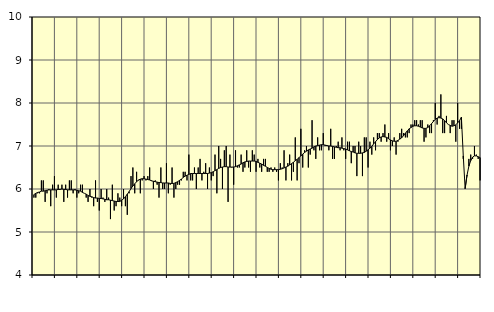
| Category | Personliga och kulturella tjänster, SNI 90-98 | Series 1 |
|---|---|---|
| nan | 5.8 | 5.87 |
| 1.0 | 5.8 | 5.9 |
| 1.0 | 5.9 | 5.92 |
| 1.0 | 5.9 | 5.93 |
| 1.0 | 6.2 | 5.95 |
| 1.0 | 6.2 | 5.95 |
| 1.0 | 5.7 | 5.96 |
| 1.0 | 5.9 | 5.97 |
| 1.0 | 6 | 5.98 |
| 1.0 | 5.6 | 5.98 |
| 1.0 | 6.1 | 5.98 |
| 1.0 | 6.3 | 5.98 |
| nan | 5.8 | 5.98 |
| 2.0 | 6.1 | 5.99 |
| 2.0 | 6 | 5.99 |
| 2.0 | 6.1 | 6 |
| 2.0 | 5.7 | 5.99 |
| 2.0 | 6.1 | 5.99 |
| 2.0 | 5.8 | 5.98 |
| 2.0 | 6.2 | 5.98 |
| 2.0 | 6.2 | 5.98 |
| 2.0 | 5.9 | 5.98 |
| 2.0 | 6 | 5.98 |
| 2.0 | 5.8 | 5.97 |
| nan | 5.9 | 5.96 |
| 3.0 | 6.1 | 5.95 |
| 3.0 | 6.1 | 5.92 |
| 3.0 | 5.9 | 5.9 |
| 3.0 | 5.8 | 5.88 |
| 3.0 | 5.7 | 5.85 |
| 3.0 | 6 | 5.83 |
| 3.0 | 5.8 | 5.82 |
| 3.0 | 5.6 | 5.8 |
| 3.0 | 6.2 | 5.79 |
| 3.0 | 5.7 | 5.79 |
| 3.0 | 5.5 | 5.78 |
| nan | 6 | 5.78 |
| 4.0 | 5.8 | 5.77 |
| 4.0 | 5.7 | 5.76 |
| 4.0 | 6 | 5.75 |
| 4.0 | 5.8 | 5.75 |
| 4.0 | 5.3 | 5.74 |
| 4.0 | 6.1 | 5.73 |
| 4.0 | 5.5 | 5.72 |
| 4.0 | 5.6 | 5.71 |
| 4.0 | 5.9 | 5.71 |
| 4.0 | 5.8 | 5.71 |
| 4.0 | 5.6 | 5.74 |
| nan | 6 | 5.77 |
| 5.0 | 5.6 | 5.82 |
| 5.0 | 5.4 | 5.88 |
| 5.0 | 5.9 | 5.94 |
| 5.0 | 6.3 | 6.01 |
| 5.0 | 6.5 | 6.07 |
| 5.0 | 5.9 | 6.12 |
| 5.0 | 6.4 | 6.17 |
| 5.0 | 6.2 | 6.21 |
| 5.0 | 5.9 | 6.23 |
| 5.0 | 6.2 | 6.24 |
| 5.0 | 6.3 | 6.24 |
| nan | 6.2 | 6.23 |
| 6.0 | 6.3 | 6.22 |
| 6.0 | 6.5 | 6.21 |
| 6.0 | 6.2 | 6.19 |
| 6.0 | 6 | 6.18 |
| 6.0 | 6.2 | 6.17 |
| 6.0 | 6.1 | 6.16 |
| 6.0 | 5.8 | 6.15 |
| 6.0 | 6.5 | 6.15 |
| 6.0 | 6 | 6.14 |
| 6.0 | 6 | 6.14 |
| 6.0 | 6.6 | 6.14 |
| nan | 5.9 | 6.14 |
| 7.0 | 6.1 | 6.13 |
| 7.0 | 6.5 | 6.13 |
| 7.0 | 5.8 | 6.13 |
| 7.0 | 6 | 6.15 |
| 7.0 | 6.1 | 6.17 |
| 7.0 | 6.1 | 6.2 |
| 7.0 | 6.2 | 6.23 |
| 7.0 | 6.4 | 6.27 |
| 7.0 | 6.4 | 6.3 |
| 7.0 | 6.2 | 6.32 |
| 7.0 | 6.8 | 6.34 |
| nan | 6.2 | 6.36 |
| 8.0 | 6.2 | 6.36 |
| 8.0 | 6.5 | 6.36 |
| 8.0 | 6 | 6.36 |
| 8.0 | 6.5 | 6.36 |
| 8.0 | 6.7 | 6.36 |
| 8.0 | 6.2 | 6.36 |
| 8.0 | 6.4 | 6.36 |
| 8.0 | 6.6 | 6.36 |
| 8.0 | 6 | 6.36 |
| 8.0 | 6.5 | 6.37 |
| 8.0 | 6.2 | 6.38 |
| nan | 6.3 | 6.4 |
| 9.0 | 6.8 | 6.43 |
| 9.0 | 5.9 | 6.45 |
| 9.0 | 7 | 6.48 |
| 9.0 | 6.7 | 6.5 |
| 9.0 | 6 | 6.51 |
| 9.0 | 6.9 | 6.52 |
| 9.0 | 7 | 6.52 |
| 9.0 | 5.7 | 6.51 |
| 9.0 | 6.8 | 6.51 |
| 9.0 | 6.5 | 6.51 |
| 9.0 | 6.1 | 6.51 |
| nan | 6.9 | 6.52 |
| 10.0 | 6.5 | 6.54 |
| 10.0 | 6.5 | 6.56 |
| 10.0 | 6.8 | 6.58 |
| 10.0 | 6.4 | 6.61 |
| 10.0 | 6.5 | 6.63 |
| 10.0 | 6.9 | 6.64 |
| 10.0 | 6.5 | 6.65 |
| 10.0 | 6.4 | 6.65 |
| 10.0 | 6.9 | 6.65 |
| 10.0 | 6.8 | 6.65 |
| 10.0 | 6.4 | 6.64 |
| nan | 6.7 | 6.62 |
| 11.0 | 6.5 | 6.6 |
| 11.0 | 6.4 | 6.58 |
| 11.0 | 6.7 | 6.55 |
| 11.0 | 6.7 | 6.53 |
| 11.0 | 6.4 | 6.5 |
| 11.0 | 6.4 | 6.48 |
| 11.0 | 6.5 | 6.46 |
| 11.0 | 6.4 | 6.45 |
| 11.0 | 6.5 | 6.45 |
| 11.0 | 6.4 | 6.45 |
| 11.0 | 6.2 | 6.45 |
| nan | 6.6 | 6.46 |
| 12.0 | 6.5 | 6.47 |
| 12.0 | 6.9 | 6.49 |
| 12.0 | 6.2 | 6.51 |
| 12.0 | 6.6 | 6.53 |
| 12.0 | 6.8 | 6.56 |
| 12.0 | 6.2 | 6.59 |
| 12.0 | 6.4 | 6.62 |
| 12.0 | 7.2 | 6.66 |
| 12.0 | 6.2 | 6.69 |
| 12.0 | 6.6 | 6.73 |
| 12.0 | 7.4 | 6.77 |
| nan | 6.5 | 6.81 |
| 13.0 | 6.9 | 6.85 |
| 13.0 | 7 | 6.88 |
| 13.0 | 6.5 | 6.91 |
| 13.0 | 6.8 | 6.93 |
| 13.0 | 7.6 | 6.95 |
| 13.0 | 6.9 | 6.98 |
| 13.0 | 6.7 | 7 |
| 13.0 | 7.2 | 7.01 |
| 13.0 | 6.9 | 7.02 |
| 13.0 | 6.9 | 7.03 |
| 13.0 | 7.3 | 7.03 |
| nan | 7 | 7.02 |
| 14.0 | 7 | 7.01 |
| 14.0 | 6.9 | 7 |
| 14.0 | 7.4 | 7 |
| 14.0 | 6.7 | 6.99 |
| 14.0 | 6.7 | 6.98 |
| 14.0 | 7 | 6.97 |
| 14.0 | 7.1 | 6.96 |
| 14.0 | 6.9 | 6.96 |
| 14.0 | 7.2 | 6.95 |
| 14.0 | 6.9 | 6.94 |
| 14.0 | 6.7 | 6.93 |
| nan | 7.1 | 6.91 |
| 15.0 | 7.1 | 6.89 |
| 15.0 | 6.6 | 6.87 |
| 15.0 | 7 | 6.86 |
| 15.0 | 7 | 6.84 |
| 15.0 | 6.3 | 6.83 |
| 15.0 | 7.1 | 6.83 |
| 15.0 | 7 | 6.83 |
| 15.0 | 6.3 | 6.84 |
| 15.0 | 7.2 | 6.85 |
| 15.0 | 7.2 | 6.88 |
| 15.0 | 6.5 | 6.91 |
| nan | 7.1 | 6.95 |
| 16.0 | 6.8 | 6.99 |
| 16.0 | 7.2 | 7.05 |
| 16.0 | 6.9 | 7.1 |
| 16.0 | 7.3 | 7.15 |
| 16.0 | 7.3 | 7.19 |
| 16.0 | 7.1 | 7.21 |
| 16.0 | 7.3 | 7.22 |
| 16.0 | 7.5 | 7.21 |
| 16.0 | 7.1 | 7.2 |
| 16.0 | 7.3 | 7.17 |
| 16.0 | 6.9 | 7.14 |
| nan | 7 | 7.12 |
| 17.0 | 7.2 | 7.11 |
| 17.0 | 6.8 | 7.11 |
| 17.0 | 7.1 | 7.13 |
| 17.0 | 7.3 | 7.16 |
| 17.0 | 7.4 | 7.19 |
| 17.0 | 7.3 | 7.24 |
| 17.0 | 7.2 | 7.3 |
| 17.0 | 7.2 | 7.35 |
| 17.0 | 7.3 | 7.4 |
| 17.0 | 7.5 | 7.43 |
| 17.0 | 7.5 | 7.46 |
| nan | 7.6 | 7.47 |
| 18.0 | 7.6 | 7.47 |
| 18.0 | 7.5 | 7.46 |
| 18.0 | 7.6 | 7.44 |
| 18.0 | 7.6 | 7.42 |
| 18.0 | 7.1 | 7.41 |
| 18.0 | 7.2 | 7.41 |
| 18.0 | 7.5 | 7.43 |
| 18.0 | 7.3 | 7.47 |
| 18.0 | 7.3 | 7.52 |
| 18.0 | 7.6 | 7.57 |
| 18.0 | 8 | 7.62 |
| nan | 7.5 | 7.65 |
| 19.0 | 7.7 | 7.66 |
| 19.0 | 8.2 | 7.65 |
| 19.0 | 7.3 | 7.63 |
| 19.0 | 7.3 | 7.59 |
| 19.0 | 7.7 | 7.54 |
| 19.0 | 7.5 | 7.5 |
| 19.0 | 7.3 | 7.48 |
| 19.0 | 7.6 | 7.46 |
| 19.0 | 7.6 | 7.47 |
| 19.0 | 7.1 | 7.49 |
| 19.0 | 8 | 7.54 |
| nan | 7.4 | 7.59 |
| 20.0 | 7.4 | 7.67 |
| 20.0 | 6.7 | 6.77 |
| 20.0 | 6 | 6.01 |
| 20.0 | 6.3 | 6.32 |
| 20.0 | 6.7 | 6.53 |
| 20.0 | 6.8 | 6.66 |
| 20.0 | 6.7 | 6.74 |
| 20.0 | 7 | 6.77 |
| 20.0 | 6.8 | 6.77 |
| 20.0 | 6.7 | 6.75 |
| 20.0 | 6.2 | 6.73 |